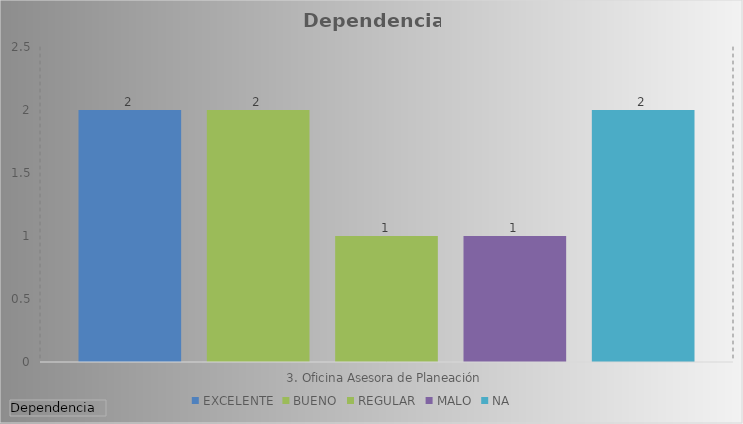
| Category | EXCELENTE | BUENO | REGULAR | MALO | NA |
|---|---|---|---|---|---|
| 3. Oficina Asesora de Planeación | 2 | 2 | 1 | 1 | 2 |